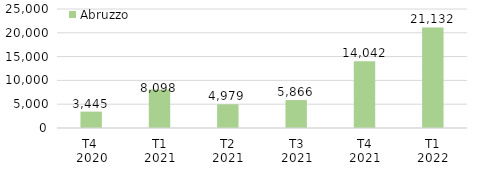
| Category | Abruzzo |
|---|---|
| T4 
2020 | 3444.891 |
| T1
2021 | 8097.711 |
| T2
2021 | 4978.78 |
| T3
2021 | 5865.63 |
| T4
2021 | 14042.38 |
| T1
2022 | 21131.544 |